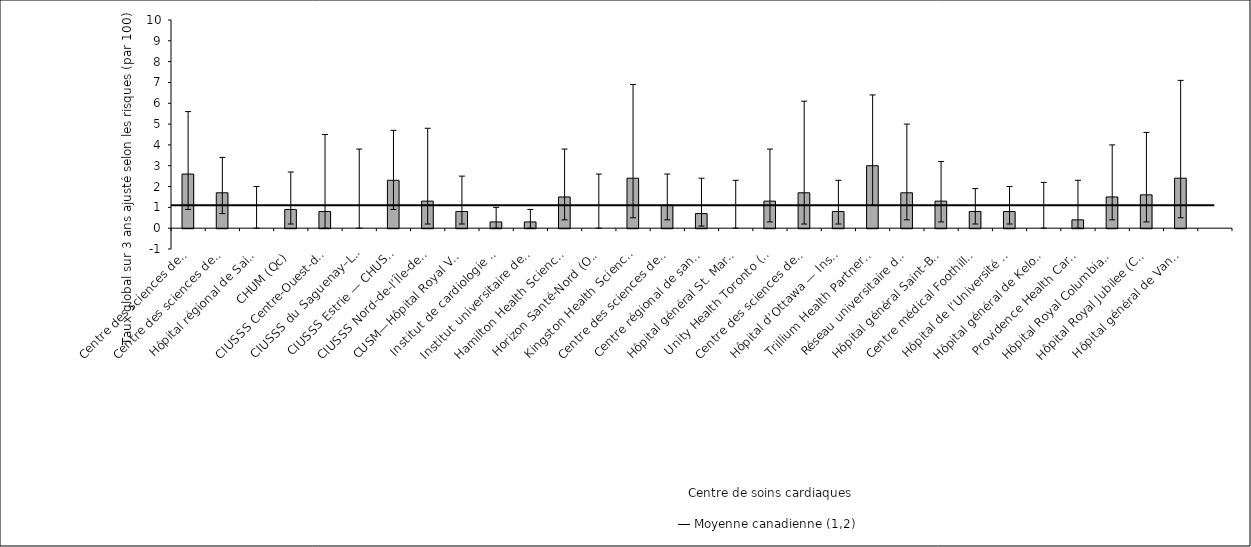
| Category | Taux ajusté selon les risques |
|---|---|
| Centre des sciences de la santé — St. John’s (T. -N.-L.) | 2.6 |
| Centre des sciences de la santé Queen Elizabeth II (N.-É.) | 1.7 |
| Hôpital régional de Saint John (N.-B.) | 0 |
| CHUM (Qc) | 0.9 |
| CIUSSS Centre-Ouest-de-l’Île-de-Mtl—Hôpital général juif (Qc) | 0.8 |
| CIUSSS du Saguenay–Lac-St-Jean—Hôpital de Chicoutimi (Qc) | 0 |
| CIUSSS Estrie — CHUS—Hôpital Fleurimont (Qc) | 2.3 |
| CIUSSS Nord-de-l’Île-de-Montréal—Hôpital du Sacré-Coeur de Montréal (Qc) | 1.3 |
| CUSM—Hôpital Royal Victoria (Qc) | 0.8 |
| Institut de cardiologie de Montréal* (Qc) | 0.3 |
| Institut universitaire de cardiologie et pneumologie de Québec* (Qc) | 0.3 |
| Hamilton Health Sciences (Ont.) | 1.5 |
| Horizon Santé-Nord (Ont.) | 0 |
| Kingston Health Sciences Centre (Ont.) | 2.4 |
| Centre des sciences de la santé de London (Ont.) | 1.1 |
| Centre régional de santé Southlake (Ont.) | 0.7 |
| Hôpital général St. Mary’s (Ont.) | 0 |
| Unity Health Toronto (Ont.) | 1.3 |
| Centre des sciences de la santé Sunnybrook (Ont.) | 1.7 |
| Hôpital d’Ottawa — Institut de cardiologie de l’Université d’Ottawa (Ont.) | 0.8 |
| Trillium Health Partners (Ont.) | 3 |
| Réseau universitaire de santé (Ont.) | 1.7 |
| Hôpital général Saint-Boniface (Man.) | 1.3 |
| Centre médical Foothills (Alb.) | 0.8 |
| Hôpital de l’Université de l’Alberta (Alb.) | 0.8 |
| Hôpital général de Kelowna (C.-B.) | 0 |
| Providence Health Care — Hôpital St. Paul’s  (Vancouver) (C.-B.) | 0.4 |
| Hôpital Royal Columbian (C.-B.) | 1.5 |
| Hôpital Royal Jubilee (C.-B.) | 1.6 |
| Hôpital général de Vancouver (C.-B.) | 2.4 |